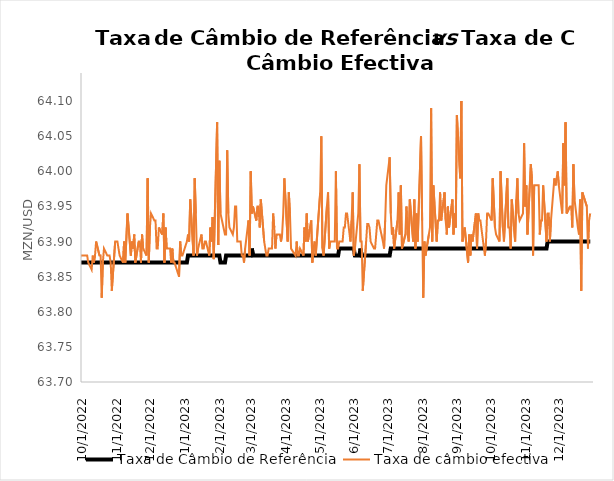
| Category | Taxa de Câmbio de Referência | Taxa de câmbio efectiva |
|---|---|---|
| 10/1/21 | 63.83 | 63.8 |
| 10/5/21 | 63.83 | 63.83 |
| 10/6/21 | 63.83 | 63.76 |
| 10/7/21 | 63.83 | 63.82 |
| 10/8/21 | 63.83 | 63.82 |
| 10/11/21 | 63.83 | 63.77 |
| 10/12/21 | 63.83 | 63.81 |
| 10/13/21 | 63.83 | 63.82 |
| 10/14/21 | 63.83 | 63.82 |
| 10/15/21 | 63.83 | 63.82 |
| 10/18/21 | 63.83 | 63.76 |
| 10/19/21 | 63.83 | 63.76 |
| 10/20/21 | 63.83 | 63.82 |
| 10/21/21 | 63.83 | 63.78 |
| 10/22/21 | 63.83 | 63.81 |
| 10/25/21 | 63.83 | 63.82 |
| 10/26/21 | 63.83 | 63.79 |
| 10/27/21 | 63.83 | 63.8 |
| 10/28/21 | 63.83 | 63.83 |
| 10/29/21 | 63.83 | 63.82 |
| 11/1/21 | 63.83 | 63.84 |
| 11/2/21 | 63.83 | 63.81 |
| 11/3/21 | 63.83 | 63.83 |
| 11/4/21 | 63.83 | 63.82 |
| 11/5/21 | 63.83 | 63.83 |
| 11/8/21 | 63.83 | 63.79 |
| 11/9/21 | 63.83 | 63.79 |
| 11/11/21 | 63.83 | 63.84 |
| 11/12/21 | 63.83 | 63.83 |
| 11/15/21 | 63.83 | 63.78 |
| 11/16/21 | 63.83 | 63.7 |
| 11/17/21 | 63.83 | 63.84 |
| 11/18/21 | 63.83 | 63.81 |
| 11/19/21 | 63.83 | 63.8 |
| 11/22/21 | 63.83 | 63.78 |
| 11/23/21 | 63.83 | 63.81 |
| 11/24/21 | 63.83 | 63.81 |
| 11/25/21 | 63.83 | 63.81 |
| 11/26/21 | 63.83 | 63.84 |
| 11/29/21 | 63.83 | 63.8 |
| 11/30/21 | 63.83 | 63.81 |
| 12/1/21 | 63.83 | 63.79 |
| 12/2/21 | 63.83 | 63.79 |
| 12/3/21 | 63.83 | 63.82 |
| 12/6/21 | 63.83 | 63.75 |
| 12/7/21 | 63.83 | 63.78 |
| 12/8/21 | 63.83 | 63.82 |
| 12/9/21 | 63.83 | 63.82 |
| 12/10/21 | 63.83 | 63.82 |
| 12/13/21 | 63.83 | 63.83 |
| 12/14/21 | 63.83 | 63.76 |
| 12/15/21 | 63.83 | 63.82 |
| 12/16/21 | 63.83 | 63.8 |
| 12/17/21 | 63.83 | 63.79 |
| 12/20/21 | 63.83 | 63.84 |
| 12/21/21 | 63.83 | 63.79 |
| 12/22/21 | 63.83 | 63.8 |
| 12/23/21 | 63.83 | 63.82 |
| 12/27/21 | 63.83 | 63.77 |
| 12/28/21 | 63.83 | 63.74 |
| 12/29/21 | 63.83 | 63.76 |
| 12/30/21 | 63.83 | 63.78 |
| 12/31/21 | 63.83 | 63.72 |
| 1/3/22 | 63.83 | 63.79 |
| 1/4/22 | 63.83 | 63.81 |
| 1/5/22 | 63.83 | 63.8 |
| 1/6/22 | 63.83 | 63.81 |
| 1/7/22 | 63.83 | 63.77 |
| 1/10/22 | 63.83 | 63.79 |
| 1/12/22 | 63.83 | 63.83 |
| 1/13/22 | 63.83 | 63.83 |
| 1/14/22 | 63.83 | 63.83 |
| 1/17/22 | 63.83 | 63.83 |
| 1/18/22 | 63.83 | 63.83 |
| 1/19/22 | 63.83 | 63.8 |
| 1/20/22 | 63.83 | 63.83 |
| 1/21/22 | 63.83 | 63.83 |
| 1/24/22 | 63.83 | 63.81 |
| 1/25/22 | 63.83 | 63.82 |
| 1/26/22 | 63.83 | 63.83 |
| 1/27/22 | 63.83 | 63.8 |
| 1/28/22 | 63.83 | 63.83 |
| 1/31/22 | 63.83 | 63.81 |
| 2/1/22 | 63.83 | 63.83 |
| 2/2/22 | 63.83 | 63.82 |
| 2/3/22 | 63.83 | 63.78 |
| 2/4/22 | 63.83 | 63.84 |
| 2/7/22 | 63.83 | 63.83 |
| 2/8/22 | 63.83 | 63.85 |
| 2/9/22 | 63.83 | 63.8 |
| 2/10/22 | 63.83 | 63.83 |
| 2/11/22 | 63.83 | 63.83 |
| 2/14/22 | 63.83 | 63.83 |
| 2/15/22 | 63.83 | 63.81 |
| 2/16/22 | 63.83 | 63.81 |
| 2/17/22 | 63.83 | 63.83 |
| 2/18/22 | 63.83 | 63.83 |
| 2/21/22 | 63.83 | 63.84 |
| 2/22/22 | 63.83 | 63.83 |
| 2/23/22 | 63.83 | 63.83 |
| 2/24/22 | 63.83 | 63.81 |
| 2/25/22 | 63.83 | 63.82 |
| 2/28/22 | 63.83 | 63.83 |
| 3/1/22 | 63.83 | 63.79 |
| 3/2/22 | 63.83 | 63.81 |
| 3/3/22 | 63.83 | 63.83 |
| 3/4/22 | 63.83 | 63.83 |
| 3/7/22 | 63.83 | 63.82 |
| 3/8/22 | 63.83 | 63.83 |
| 3/9/22 | 63.83 | 63.76 |
| 3/10/22 | 63.83 | 63.82 |
| 3/11/22 | 63.83 | 63.83 |
| 3/14/22 | 63.83 | 63.83 |
| 3/15/22 | 63.83 | 63.82 |
| 3/16/22 | 63.83 | 63.82 |
| 3/17/22 | 63.83 | 63.82 |
| 3/18/22 | 63.83 | 63.84 |
| 3/21/22 | 63.83 | 63.8 |
| 3/22/22 | 63.83 | 63.8 |
| 3/23/22 | 63.83 | 63.82 |
| 3/24/22 | 63.83 | 63.84 |
| 3/25/22 | 63.83 | 63.83 |
| 3/28/22 | 63.83 | 63.73 |
| 3/29/22 | 63.83 | 63.88 |
| 3/30/22 | 63.83 | 63.82 |
| 3/31/22 | 63.83 | 63.84 |
| 4/1/22 | 63.83 | 63.83 |
| 4/4/22 | 63.83 | 63.83 |
| 4/5/22 | 63.83 | 63.84 |
| 4/6/22 | 63.83 | 63.83 |
| 4/8/22 | 63.83 | 63.83 |
| 4/11/22 | 63.83 | 63.83 |
| 4/12/22 | 63.83 | 63.77 |
| 4/13/22 | 63.83 | 63.83 |
| 4/14/22 | 63.83 | 63.83 |
| 4/18/22 | 63.83 | 63.83 |
| 4/19/22 | 63.83 | 63.83 |
| 4/20/22 | 63.83 | 63.84 |
| 4/21/22 | 63.83 | 63.85 |
| 4/22/22 | 63.83 | 63.83 |
| 4/25/20 | 63.83 | 63.81 |
| 4/26/22 | 63.83 | 63.83 |
| 4/27/22 | 63.83 | 63.82 |
| 4/28/22 | 63.83 | 63.83 |
| 4/29/22 | 63.83 | 63.83 |
| 5/3/22 | 63.83 | 63.83 |
| 5/4/22 | 63.83 | 63.84 |
| 5/5/22 | 63.83 | 63.82 |
| 5/6/22 | 63.83 | 63.82 |
| 5/9/22 | 63.83 | 63.82 |
| 5/10/22 | 63.83 | 63.83 |
| 5/11/22 | 63.83 | 63.83 |
| 5/12/22 | 63.83 | 63.79 |
| 5/13/22 | 63.83 | 63.83 |
| 5/16/22 | 63.83 | 63.85 |
| 5/17/22 | 63.83 | 63.82 |
| 5/18/22 | 63.83 | 63.83 |
| 5/19/22 | 63.83 | 63.83 |
| 5/20/22 | 63.83 | 63.84 |
| 5/23/22 | 63.83 | 63.84 |
| 5/24/22 | 63.83 | 63.83 |
| 5/25/22 | 63.84 | 63.79 |
| 5/26/22 | 63.84 | 63.87 |
| 5/27/22 | 63.84 | 63.91 |
| 5/30/22 | 63.84 | 63.8 |
| 5/31/22 | 63.84 | 63.84 |
| 6/1/22 | 63.84 | 63.85 |
| 6/2/22 | 63.84 | 63.84 |
| 6/3/22 | 63.84 | 63.85 |
| 6/6/22 | 63.85 | 63.86 |
| 6/7/22 | 63.85 | 63.84 |
| 6/8/22 | 63.85 | 63.85 |
| 6/9/22 | 63.85 | 63.83 |
| 6/10/22 | 63.85 | 63.85 |
| 6/13/22 | 63.85 | 63.84 |
| 6/14/22 | 63.85 | 63.85 |
| 6/15/22 | 63.85 | 63.85 |
| 6/16/22 | 63.85 | 63.85 |
| 6/17/22 | 63.85 | 63.84 |
| 6/20/22 | 63.85 | 63.82 |
| 6/21/22 | 63.86 | 63.86 |
| 6/22/22 | 63.86 | 63.83 |
| 6/23/22 | 63.86 | 63.86 |
| 6/24/22 | 63.86 | 63.86 |
| 6/27/22 | 63.86 | 63.87 |
| 6/28/22 | 63.86 | 63.85 |
| 6/29/22 | 63.86 | 63.86 |
| 6/30/22 | 63.86 | 63.83 |
| 7/1/22 | 63.86 | 63.85 |
| 7/4/22 | 63.86 | 63.86 |
| 7/5/22 | 63.86 | 63.87 |
| 7/6/22 | 63.86 | 63.87 |
| 7/7/22 | 63.86 | 63.89 |
| 7/8/22 | 63.86 | 63.86 |
| 7/11/22 | 63.86 | 63.88 |
| 7/12/22 | 63.86 | 63.87 |
| 7/13/22 | 63.86 | 63.86 |
| 7/14/22 | 63.86 | 63.86 |
| 7/15/22 | 63.86 | 63.89 |
| 7/18/22 | 63.86 | 63.94 |
| 7/19/22 | 63.86 | 63.91 |
| 7/20/22 | 63.86 | 63.87 |
| 7/21/22 | 63.86 | 63.92 |
| 7/22/22 | 63.86 | 63.84 |
| 7/25/22 | 63.87 | 63.88 |
| 7/26/22 | 63.87 | 63.89 |
| 7/27/22 | 63.87 | 63.87 |
| 7/28/22 | 63.87 | 63.87 |
| 7/29/22 | 63.87 | 63.86 |
| 8/1/22 | 63.87 | 63.83 |
| 8/2/22 | 63.87 | 63.87 |
| 8/3/22 | 63.87 | 63.89 |
| 8/4/22 | 63.87 | 63.87 |
| 8/5/22 | 63.87 | 63.87 |
| 8/8/22 | 63.87 | 63.9 |
| 8/9/22 | 63.87 | 63.87 |
| 8/10/22 | 63.87 | 63.88 |
| 8/11/22 | 63.87 | 63.88 |
| 8/12/22 | 63.87 | 63.88 |
| 8/15/22 | 63.87 | 63.87 |
| 8/16/22 | 63.87 | 63.88 |
| 8/17/22 | 63.87 | 63.89 |
| 8/18/22 | 63.87 | 63.82 |
| 8/19/22 | 63.87 | 63.88 |
| 8/22/22 | 63.87 | 63.92 |
| 8/23/22 | 63.87 | 63.87 |
| 8/24/22 | 63.87 | 63.88 |
| 8/25/22 | 63.87 | 63.87 |
| 8/26/22 | 63.87 | 63.82 |
| 8/29/22 | 63.87 | 63.89 |
| 8/30/22 | 63.87 | 63.88 |
| 9/1/22 | 63.87 | 63.92 |
| 9/2/22 | 63.87 | 63.91 |
| 9/5/22 | 63.87 | 63.88 |
| 9/6/22 | 63.87 | 63.87 |
| 9/8/22 | 63.87 | 63.89 |
| 9/9/22 | 63.87 | 63.82 |
| 9/12/22 | 63.87 | 63.89 |
| 9/13/22 | 63.87 | 63.89 |
| 9/14/22 | 63.87 | 63.88 |
| 9/15/22 | 63.87 | 63.89 |
| 9/16/22 | 63.87 | 63.91 |
| 9/19/22 | 63.87 | 63.89 |
| 9/20/22 | 63.87 | 63.89 |
| 9/21/22 | 63.87 | 63.87 |
| 9/22/22 | 63.87 | 63.91 |
| 9/23/22 | 63.87 | 63.88 |
| 9/27/22 | 63.87 | 63.87 |
| 9/28/22 | 63.87 | 63.78 |
| 9/29/22 | 63.87 | 63.87 |
| 9/30/22 | 63.87 | 63.88 |
| 10/3/22 | 63.87 | 63.88 |
| 10/5/22 | 63.87 | 63.88 |
| 10/6/22 | 63.87 | 63.88 |
| 10/7/22 | 63.87 | 63.87 |
| 10/10/22 | 63.87 | 63.86 |
| 10/11/22 | 63.87 | 63.88 |
| 10/12/22 | 63.87 | 63.87 |
| 10/13/22 | 63.87 | 63.88 |
| 10/14/22 | 63.87 | 63.9 |
| 10/17/22 | 63.87 | 63.88 |
| 10/18/22 | 63.87 | 63.88 |
| 10/19/22 | 63.87 | 63.82 |
| 10/20/22 | 63.87 | 63.87 |
| 10/21/22 | 63.87 | 63.89 |
| 10/24/22 | 63.87 | 63.88 |
| 10/25/22 | 63.87 | 63.88 |
| 10/26/22 | 63.87 | 63.88 |
| 10/27/22 | 63.87 | 63.87 |
| 10/28/22 | 63.87 | 63.83 |
| 10/31/22 | 63.87 | 63.9 |
| 11/1/22 | 63.87 | 63.9 |
| 11/2/22 | 63.87 | 63.9 |
| 11/3/22 | 63.87 | 63.89 |
| 11/4/22 | 63.87 | 63.88 |
| 11/7/22 | 63.87 | 63.87 |
| 11/8/22 | 63.87 | 63.9 |
| 11/9/22 | 63.87 | 63.87 |
| 11/11/22 | 63.87 | 63.94 |
| 11/14/22 | 63.87 | 63.88 |
| 11/15/22 | 63.87 | 63.9 |
| 11/16/22 | 63.87 | 63.89 |
| 11/17/22 | 63.87 | 63.91 |
| 11/18/22 | 63.87 | 63.87 |
| 11/21/22 | 63.87 | 63.9 |
| 11/22/22 | 63.87 | 63.9 |
| 11/23/22 | 63.87 | 63.87 |
| 11/24/22 | 63.87 | 63.91 |
| 11/25/22 | 63.87 | 63.89 |
| 11/28/22 | 63.87 | 63.88 |
| 11/29/22 | 63.87 | 63.99 |
| 11/30/22 | 63.87 | 63.87 |
| 12/1/22 | 63.87 | 63.92 |
| 12/2/22 | 63.87 | 63.94 |
| 12/5/22 | 63.87 | 63.93 |
| 12/6/22 | 63.87 | 63.93 |
| 12/7/22 | 63.87 | 63.89 |
| 12/8/22 | 63.87 | 63.89 |
| 12/9/22 | 63.87 | 63.92 |
| 12/12/22 | 63.87 | 63.91 |
| 12/13/22 | 63.87 | 63.94 |
| 12/14/22 | 63.87 | 63.87 |
| 12/15/22 | 63.87 | 63.92 |
| 12/16/22 | 63.87 | 63.89 |
| 12/19/22 | 63.87 | 63.89 |
| 12/20/22 | 63.87 | 63.87 |
| 12/21/22 | 63.87 | 63.89 |
| 12/22/22 | 63.87 | 63.87 |
| 12/23/22 | 63.87 | 63.87 |
| 12/27/22 | 63.87 | 63.85 |
| 12/28/22 | 63.87 | 63.9 |
| 12/29/22 | 63.87 | 63.88 |
| 12/30/22 | 63.87 | 63.88 |
| 1/3/23 | 63.87 | 63.9 |
| 1/4/23 | 63.88 | 63.91 |
| 1/5/23 | 63.88 | 63.9 |
| 1/6/23 | 63.88 | 63.96 |
| 1/9/23 | 63.88 | 63.88 |
| 1/10/23 | 63.88 | 63.99 |
| 1/11/23 | 63.88 | 63.94 |
| 1/12/23 | 63.88 | 63.88 |
| 1/13/23 | 63.88 | 63.89 |
| 1/16/23 | 63.88 | 63.91 |
| 1/17/23 | 63.88 | 63.89 |
| 1/18/23 | 63.88 | 63.89 |
| 1/19/23 | 63.88 | 63.9 |
| 1/20/23 | 63.88 | 63.9 |
| 1/23/23 | 63.88 | 63.88 |
| 1/24/23 | 63.88 | 63.92 |
| 1/25/23 | 63.88 | 63.9 |
| 1/26/23 | 63.88 | 63.935 |
| 1/27/23 | 63.88 | 63.875 |
| 1/30/23 | 63.88 | 64.07 |
| 1/31/23 | 63.88 | 63.895 |
| 2/1/23 | 63.88 | 64.015 |
| 2/2/23 | 63.87 | 63.94 |
| 2/6/23 | 63.87 | 63.91 |
| 2/7/23 | 63.88 | 63.91 |
| 2/8/23 | 63.88 | 64.03 |
| 2/9/23 | 63.88 | 63.94 |
| 2/10/23 | 63.88 | 63.92 |
| 2/13/23 | 63.88 | 63.91 |
| 2/14/23 | 63.88 | 63.92 |
| 2/15/23 | 63.88 | 63.95 |
| 2/16/23 | 63.88 | 63.95 |
| 2/17/23 | 63.88 | 63.9 |
| 2/20/23 | 63.88 | 63.9 |
| 2/21/23 | 63.88 | 63.88 |
| 2/22/23 | 63.88 | 63.88 |
| 2/23/23 | 63.88 | 63.87 |
| 2/24/23 | 63.88 | 63.89 |
| 2/27/23 | 63.88 | 63.93 |
| 2/28/23 | 63.88 | 63.88 |
| 3/1/23 | 63.88 | 64 |
| 3/2/23 | 63.89 | 63.94 |
| 3/3/23 | 63.88 | 63.95 |
| 3/6/23 | 63.88 | 63.93 |
| 3/7/23 | 63.88 | 63.95 |
| 3/8/23 | 63.88 | 63.95 |
| 3/9/23 | 63.88 | 63.92 |
| 3/10/23 | 63.88 | 63.96 |
| 3/13/23 | 63.88 | 63.9 |
| 3/14/23 | 63.88 | 63.89 |
| 3/15/23 | 63.88 | 63.88 |
| 3/16/23 | 63.88 | 63.88 |
| 3/17/23 | 63.88 | 63.89 |
| 3/20/23 | 63.88 | 63.89 |
| 3/21/23 | 63.88 | 63.94 |
| 3/22/23 | 63.88 | 63.92 |
| 3/23/23 | 63.88 | 63.89 |
| 3/24/23 | 63.88 | 63.91 |
| 3/27/23 | 63.88 | 63.91 |
| 3/28/23 | 63.88 | 63.9 |
| 3/29/23 | 63.88 | 63.91 |
| 3/30/23 | 63.88 | 63.94 |
| 3/31/23 | 63.88 | 63.99 |
| 4/3/23 | 63.88 | 63.9 |
| 4/4/23 | 63.88 | 63.97 |
| 4/5/23 | 63.88 | 63.94 |
| 4/6/23 | 63.88 | 63.89 |
| 4/10/23 | 63.88 | 63.88 |
| 4/11/23 | 63.88 | 63.9 |
| 4/12/23 | 63.88 | 63.88 |
| 4/13/23 | 63.88 | 63.88 |
| 4/14/23 | 63.88 | 63.89 |
| 4/17/23 | 63.88 | 63.88 |
| 4/18/23 | 63.88 | 63.92 |
| 4/19/23 | 63.88 | 63.9 |
| 4/20/23 | 63.88 | 63.94 |
| 4/21/23 | 63.88 | 63.9 |
| 4/24/23 | 63.88 | 63.93 |
| 4/25/23 | 63.88 | 63.87 |
| 4/26/23 | 63.88 | 63.89 |
| 4/27/23 | 63.88 | 63.9 |
| 4/28/23 | 63.88 | 63.88 |
| 5/2/23 | 63.88 | 63.97 |
| 5/3/23 | 63.88 | 64.05 |
| 5/4/23 | 63.88 | 63.89 |
| 5/5/23 | 63.88 | 63.88 |
| 5/8/23 | 63.88 | 63.95 |
| 5/9/23 | 63.88 | 63.97 |
| 5/10/23 | 63.88 | 63.89 |
| 5/11/23 | 63.88 | 63.9 |
| 5/12/23 | 63.88 | 63.9 |
| 5/15/23 | 63.88 | 63.9 |
| 5/16/23 | 63.88 | 64 |
| 5/17/23 | 63.88 | 63.89 |
| 5/18/23 | 63.88 | 63.89 |
| 5/19/23 | 63.89 | 63.9 |
| 5/22/23 | 63.89 | 63.9 |
| 5/23/23 | 63.89 | 63.92 |
| 5/24/23 | 63.89 | 63.92 |
| 5/25/23 | 63.89 | 63.94 |
| 5/26/23 | 63.89 | 63.94 |
| 5/29/23 | 63.89 | 63.9 |
| 5/30/23 | 63.89 | 63.93 |
| 5/31/23 | 63.89 | 63.97 |
| 6/1/23 | 63.89 | 63.88 |
| 6/2/23 | 63.88 | 63.89 |
| 6/5/23 | 63.88 | 63.94 |
| 6/6/23 | 63.88 | 64.01 |
| 6/7/23 | 63.89 | 63.9 |
| 6/8/23 | 63.88 | 63.9 |
| 6/9/23 | 63.88 | 63.83 |
| 6/12/23 | 63.88 | 63.9 |
| 6/13/23 | 63.88 | 63.925 |
| 6/14/23 | 63.88 | 63.925 |
| 6/15/23 | 63.88 | 63.92 |
| 6/16/23 | 63.88 | 63.9 |
| 6/19/23 | 63.88 | 63.89 |
| 6/20/23 | 63.88 | 63.89 |
| 6/21/23 | 63.88 | 63.91 |
| 6/22/23 | 63.88 | 63.93 |
| 6/23/23 | 63.88 | 63.93 |
| 6/27/23 | 63.88 | 63.9 |
| 6/28/23 | 63.88 | 63.89 |
| 6/29/23 | 63.88 | 63.93 |
| 6/30/23 | 63.88 | 63.98 |
| 7/3/23 | 63.88 | 64.02 |
| 7/4/23 | 63.89 | 63.94 |
| 7/5/23 | 63.89 | 63.91 |
| 7/6/23 | 63.89 | 63.92 |
| 7/7/23 | 63.89 | 63.89 |
| 7/10/23 | 63.89 | 63.93 |
| 7/11/23 | 63.89 | 63.97 |
| 7/12/23 | 63.89 | 63.91 |
| 7/13/23 | 63.89 | 63.98 |
| 7/14/23 | 63.89 | 63.89 |
| 7/17/23 | 63.89 | 63.91 |
| 7/18/23 | 63.89 | 63.95 |
| 7/19/23 | 63.89 | 63.91 |
| 7/20/23 | 63.89 | 63.9 |
| 7/21/23 | 63.89 | 63.96 |
| 7/24/23 | 63.89 | 63.9 |
| 7/25/23 | 63.89 | 63.96 |
| 7/26/23 | 63.89 | 63.89 |
| 7/27/23 | 63.89 | 63.94 |
| 7/28/23 | 63.89 | 63.9 |
| 7/31/23 | 63.89 | 64.05 |
| 8/1/23 | 63.89 | 63.93 |
| 8/2/23 | 63.89 | 63.82 |
| 8/3/23 | 63.89 | 63.9 |
| 8/4/23 | 63.89 | 63.88 |
| 8/7/23 | 63.89 | 63.91 |
| 8/8/23 | 63.89 | 63.92 |
| 8/9/23 | 63.89 | 64.09 |
| 8/10/23 | 63.89 | 63.9 |
| 8/11/23 | 63.89 | 63.98 |
| 8/14/23 | 63.89 | 63.9 |
| 8/15/23 | 63.89 | 63.93 |
| 8/16/23 | 63.89 | 63.93 |
| 8/17/23 | 63.89 | 63.97 |
| 8/18/23 | 63.89 | 63.93 |
| 8/21/23 | 63.89 | 63.97 |
| 8/22/23 | 63.89 | 63.93 |
| 8/23/23 | 63.89 | 63.91 |
| 8/24/23 | 63.89 | 63.95 |
| 8/25/23 | 63.89 | 63.92 |
| 8/28/23 | 63.89 | 63.96 |
| 8/29/23 | 63.89 | 63.91 |
| 8/30/23 | 63.89 | 63.94 |
| 8/31/23 | 63.89 | 63.92 |
| 9/1/23 | 63.89 | 64.08 |
| 9/4/23 | 63.89 | 63.99 |
| 9/5/23 | 63.89 | 64.1 |
| 9/6/23 | 63.89 | 63.9 |
| 9/8/23 | 63.89 | 63.92 |
| 9/11/23 | 63.89 | 63.87 |
| 9/12/23 | 63.89 | 63.91 |
| 9/13/23 | 63.89 | 63.88 |
| 9/14/23 | 63.89 | 63.91 |
| 9/15/23 | 63.89 | 63.9 |
| 9/18/23 | 63.89 | 63.94 |
| 9/19/23 | 63.89 | 63.89 |
| 9/20/23 | 63.89 | 63.94 |
| 9/21/23 | 63.89 | 63.93 |
| 9/22/23 | 63.89 | 63.93 |
| 9/26/23 | 63.89 | 63.88 |
| 9/27/23 | 63.89 | 63.9 |
| 9/28/23 | 63.89 | 63.94 |
| 9/29/23 | 63.89 | 63.94 |
| 10/2/23 | 63.89 | 63.93 |
| 10/3/23 | 63.89 | 63.99 |
| 10/5/23 | 63.89 | 63.92 |
| 10/6/23 | 63.89 | 63.91 |
| 10/9/23 | 63.89 | 63.9 |
| 10/10/23 | 63.89 | 64 |
| 10/12/23 | 63.89 | 63.92 |
| 10/13/23 | 63.89 | 63.9 |
| 10/16/23 | 63.89 | 63.99 |
| 10/17/23 | 63.89 | 63.92 |
| 10/18/23 | 63.89 | 63.92 |
| 10/19/23 | 63.89 | 63.89 |
| 10/20/23 | 63.89 | 63.96 |
| 10/23/23 | 63.89 | 63.9 |
| 10/24/23 | 63.89 | 63.96 |
| 10/25/23 | 63.89 | 63.99 |
| 10/26/23 | 63.89 | 63.94 |
| 10/27/23 | 63.89 | 63.93 |
| 10/30/23 | 63.89 | 63.94 |
| 10/31/23 | 63.89 | 64.04 |
| 11/1/23 | 63.89 | 63.95 |
| 11/2/23 | 63.89 | 63.98 |
| 11/3/23 | 63.89 | 63.91 |
| 11/6/23 | 63.89 | 64.01 |
| 11/7/23 | 63.89 | 63.99 |
| 11/8/23 | 63.89 | 63.88 |
| 11/9/23 | 63.89 | 63.98 |
| 11/13/23 | 63.89 | 63.98 |
| 11/14/23 | 63.89 | 63.91 |
| 11/15/23 | 63.89 | 63.93 |
| 11/16/23 | 63.89 | 63.93 |
| 11/17/23 | 63.89 | 63.98 |
| 11/20/23 | 63.89 | 63.9 |
| 11/21/23 | 63.9 | 63.94 |
| 11/22/23 | 63.9 | 63.94 |
| 11/23/23 | 63.9 | 63.9 |
| 11/24/23 | 63.9 | 63.93 |
| 11/27/23 | 63.9 | 63.99 |
| 11/28/23 | 63.9 | 63.98 |
| 11/29/23 | 63.9 | 63.99 |
| 11/30/23 | 63.9 | 64 |
| 12/1/23 | 63.9 | 63.98 |
| 12/4/23 | 63.9 | 63.94 |
| 12/5/23 | 63.9 | 64.04 |
| 12/6/23 | 63.9 | 63.98 |
| 12/7/23 | 63.9 | 64.07 |
| 12/8/23 | 63.9 | 63.94 |
| 12/11/23 | 63.9 | 63.95 |
| 12/12/23 | 63.9 | 63.95 |
| 12/13/23 | 63.9 | 63.92 |
| 12/14/23 | 63.9 | 64.01 |
| 12/15/23 | 63.9 | 63.96 |
| 12/18/23 | 63.9 | 63.92 |
| 12/19/23 | 63.9 | 63.91 |
| 12/20/23 | 63.9 | 63.96 |
| 12/21/23 | 63.9 | 63.83 |
| 12/22/23 | 63.9 | 63.97 |
| 12/26/23 | 63.9 | 63.95 |
| 12/27/23 | 63.9 | 63.89 |
| 12/28/23 | 63.9 | 63.93 |
| 12/29/23 | 63.9 | 63.94 |